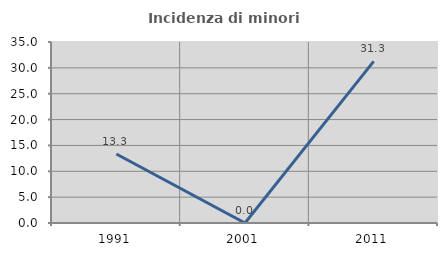
| Category | Incidenza di minori stranieri |
|---|---|
| 1991.0 | 13.333 |
| 2001.0 | 0 |
| 2011.0 | 31.25 |